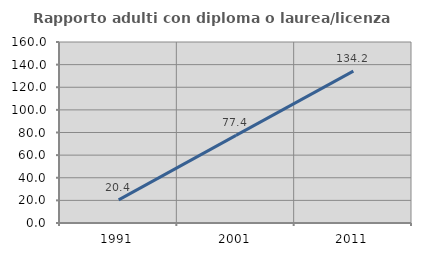
| Category | Rapporto adulti con diploma o laurea/licenza media  |
|---|---|
| 1991.0 | 20.438 |
| 2001.0 | 77.419 |
| 2011.0 | 134.211 |